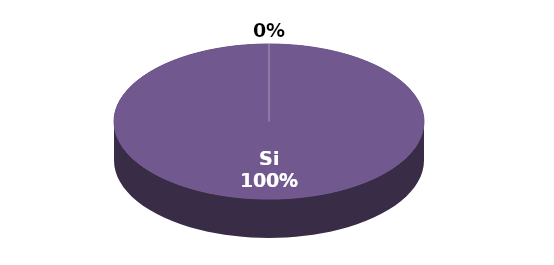
| Category | Series 1 |
|---|---|
| Si | 16 |